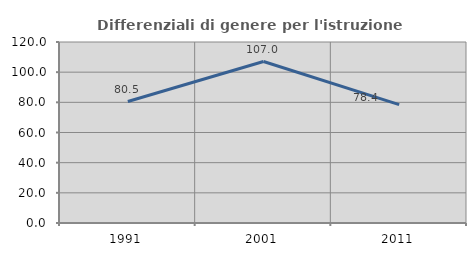
| Category | Differenziali di genere per l'istruzione superiore |
|---|---|
| 1991.0 | 80.515 |
| 2001.0 | 107.041 |
| 2011.0 | 78.448 |